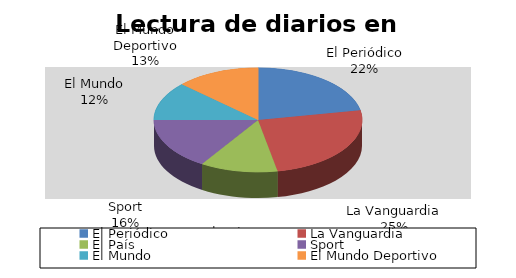
| Category | Series 0 |
|---|---|
| El Periódico | 0.22 |
| La Vanguardia | 0.25 |
| El País | 0.12 |
| Sport | 0.16 |
| El Mundo | 0.12 |
| El Mundo Deportivo | 0.13 |